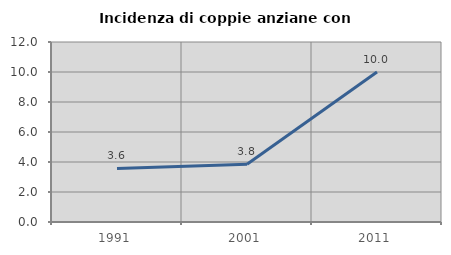
| Category | Incidenza di coppie anziane con figli |
|---|---|
| 1991.0 | 3.571 |
| 2001.0 | 3.846 |
| 2011.0 | 10 |